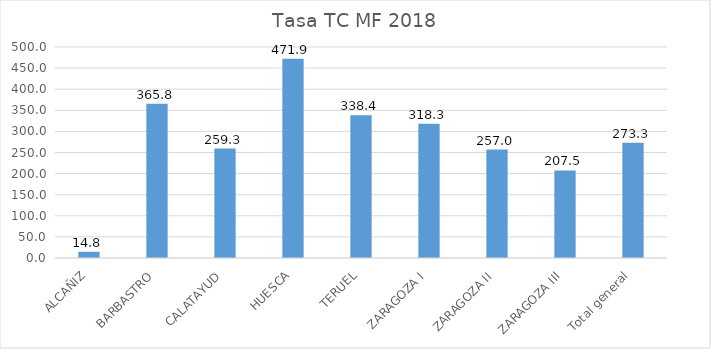
| Category | 1SEM2108 |
|---|---|
| ALCAÑIZ | 14.779 |
| BARBASTRO | 365.788 |
| CALATAYUD | 259.313 |
| HUESCA | 471.889 |
| TERUEL | 338.388 |
| ZARAGOZA I | 318.275 |
| ZARAGOZA II | 257.012 |
| ZARAGOZA III | 207.503 |
| Total general | 273.296 |